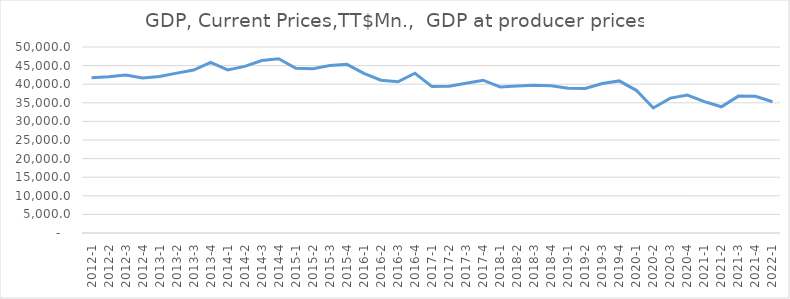
| Category | Series 0 |
|---|---|
| 2012-1 | 41726.305 |
| 2012-2 | 41974.203 |
| 2012-3 | 42495.55 |
| 2012-4 | 41653.552 |
| 2013-1 | 42079.869 |
| 2013-2 | 42973.211 |
| 2013-3 | 43799.02 |
| 2013-4 | 45888.954 |
| 2014-1 | 43820.337 |
| 2014-2 | 44781.663 |
| 2014-3 | 46381.127 |
| 2014-4 | 46827.969 |
| 2015-1 | 44303.226 |
| 2015-2 | 44176.092 |
| 2015-3 | 45046.793 |
| 2015-4 | 45325.056 |
| 2016-1 | 42933.026 |
| 2016-2 | 41078.736 |
| 2016-3 | 40664.131 |
| 2016-4 | 42938.891 |
| 2017-1 | 39365.856 |
| 2017-2 | 39466.554 |
| 2017-3 | 40254.631 |
| 2017-4 | 41070.297 |
| 2018-1 | 39266.065 |
| 2018-2 | 39533.03 |
| 2018-3 | 39690.135 |
| 2018-4 | 39581.596 |
| 2019-1 | 38928.924 |
| 2019-2 | 38833.397 |
| 2019-3 | 40176.859 |
| 2019-4 | 40883.925 |
| 2020-1 | 38352.898 |
| 2020-2 | 33619.605 |
| 2020-3 | 36251.479 |
| 2020-4 | 37077.824 |
| 2021-1 | 35318.893 |
| 2021-2 | 33934.718 |
| 2021-3 | 36796.236 |
| 2021-4 | 36749.663 |
| 2022-1 | 35276.437 |